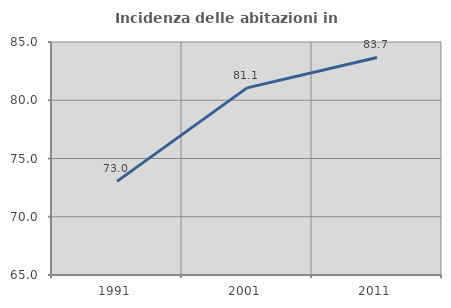
| Category | Incidenza delle abitazioni in proprietà  |
|---|---|
| 1991.0 | 73.034 |
| 2001.0 | 81.063 |
| 2011.0 | 83.676 |